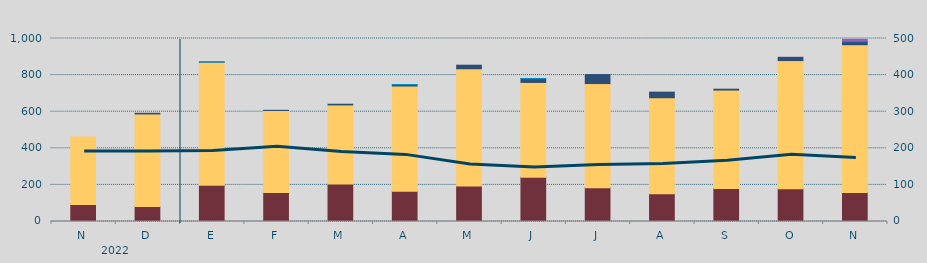
| Category | Carbón | Ciclo Combinado | Cogeneración | Consumo Bombeo | Eólica | Hidráulica | Otras Renovables | Solar fotovoltaica | Solar térmica | Turbinación bombeo | Nuclear |
|---|---|---|---|---|---|---|---|---|---|---|---|
| N | 92910 | 369242.3 | 0 | 0 | 0 | 0 | 0 | 0 | 0 | 0 | 0 |
| D | 82210 | 505508.6 | 0 | 3568.7 | 0 | 0 | 0 | 0 | 0 | 0 | 0 |
| E | 198667 | 672278.9 | 0 | 600 | 0 | 167.2 | 0 | 0 | 0 | 0 | 0 |
| F | 158446.8 | 448230.6 | 0 | 876 | 0 | 0 | 0 | 0 | 0 | 0 | 0 |
| M | 205470 | 431456.4 | 0 | 3844 | 0 | 0 | 0 | 0 | 0 | 0 | 0 |
| A | 165579 | 574881.6 | 0 | 7190 | 0 | 954 | 0 | 0 | 0 | 0 | 0 |
| M | 194640 | 639265.9 | 701 | 19503.3 | 0 | 0 | 0 | 0 | 0 | 0 | 0 |
| J | 241510 | 518484.5 | 0 | 20561.8 | 0 | 350.1 | 0 | 0 | 0 | 0 | 0 |
| J | 184698 | 569012.5 | 0 | 49075.9 | 0 | 0 | 0 | 0 | 0 | 0 | 0 |
| A | 151988 | 524255.8 | 0 | 30631.6 | 0 | 0 | 0 | 0 | 0 | 0 | 0 |
| S | 180894 | 537393.3 | 0 | 4681.3 | 0 | 0 | 0 | 0 | 0 | 0 | 0 |
| O | 179348.9 | 699577 | 400 | 17036.6 | 0 | 0 | 1381 | 0 | 0 | 0 | 0 |
| N | 158625 | 806211.9 | 1123.9 | 16397.2 | 0 | 180 | 12732 | 0 | 0 | 0 | 0 |